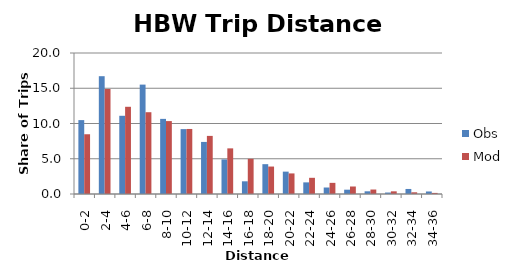
| Category | Obs | Mod |
|---|---|---|
| 0-2 | 10.481 | 8.475 |
| 2-4 | 16.71 | 14.894 |
| 4-6 | 11.094 | 12.37 |
| 6-8 | 15.517 | 11.601 |
| 8-10 | 10.656 | 10.342 |
| 10-12 | 9.203 | 9.225 |
| 12-14 | 7.386 | 8.242 |
| 14-16 | 4.906 | 6.472 |
| 16-18 | 1.8 | 4.993 |
| 18-20 | 4.231 | 3.895 |
| 20-22 | 3.173 | 2.919 |
| 22-24 | 1.649 | 2.297 |
| 24-26 | 0.921 | 1.58 |
| 26-28 | 0.612 | 1.064 |
| 28-30 | 0.381 | 0.635 |
| 30-32 | 0.208 | 0.379 |
| 32-34 | 0.715 | 0.242 |
| 34-36 | 0.357 | 0.155 |